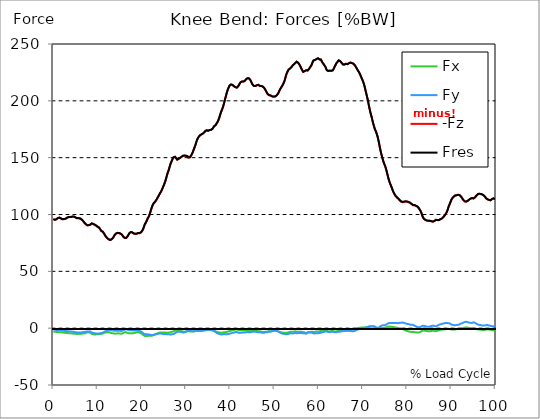
| Category |  Fx |  Fy |  -Fz |  Fres |
|---|---|---|---|---|
| 0.0 | -3.083 | -1.199 | 95.874 | 95.947 |
| 0.167348456675344 | -3.11 | -1.211 | 95.388 | 95.46 |
| 0.334696913350688 | -3.159 | -1.304 | 95.279 | 95.352 |
| 0.5020453700260321 | -3.216 | -1.4 | 95.448 | 95.524 |
| 0.669393826701376 | -3.325 | -1.585 | 95.747 | 95.833 |
| 0.83674228337672 | -3.405 | -1.654 | 96.37 | 96.46 |
| 1.0040907400520642 | -3.399 | -1.592 | 96.718 | 96.81 |
| 1.1621420602454444 | -3.448 | -1.61 | 97.039 | 97.135 |
| 1.3294905169207885 | -3.577 | -1.781 | 97.207 | 97.317 |
| 1.4968389735961325 | -3.534 | -1.724 | 97.079 | 97.185 |
| 1.6641874302714765 | -3.531 | -1.767 | 96.593 | 96.695 |
| 1.8315358869468206 | -3.72 | -2.048 | 95.954 | 96.06 |
| 1.9988843436221646 | -3.826 | -2.239 | 95.81 | 95.921 |
| 2.1662328002975086 | -3.857 | -2.257 | 95.777 | 95.89 |
| 2.333581256972853 | -3.93 | -2.31 | 95.848 | 95.965 |
| 2.5009297136481967 | -4.018 | -2.383 | 95.943 | 96.065 |
| 2.6682781703235405 | -4.071 | -2.426 | 96.116 | 96.24 |
| 2.8356266269988843 | -4.173 | -2.52 | 96.348 | 96.48 |
| 3.002975083674229 | -4.272 | -2.604 | 96.794 | 96.93 |
| 3.1703235403495724 | -4.304 | -2.62 | 97.168 | 97.306 |
| 3.337671997024917 | -4.336 | -2.635 | 97.542 | 97.682 |
| 3.4957233172182973 | -4.436 | -2.772 | 97.729 | 97.876 |
| 3.663071773893641 | -4.496 | -2.835 | 97.71 | 97.861 |
| 3.8304202305689854 | -4.488 | -2.792 | 97.699 | 97.848 |
| 3.997768687244329 | -4.543 | -2.868 | 97.784 | 97.94 |
| 4.165117143919673 | -4.644 | -3.004 | 97.92 | 98.085 |
| 4.332465600595017 | -4.752 | -3.141 | 98.023 | 98.201 |
| 4.499814057270361 | -4.808 | -3.254 | 98.045 | 98.231 |
| 4.667162513945706 | -4.84 | -3.345 | 98.002 | 98.194 |
| 4.834510970621049 | -4.851 | -3.412 | 97.743 | 97.933 |
| 5.001859427296393 | -4.947 | -3.552 | 97.339 | 97.536 |
| 5.169207883971737 | -5.044 | -3.691 | 96.933 | 97.14 |
| 5.336556340647081 | -5.121 | -3.804 | 96.595 | 96.808 |
| 5.503904797322425 | -5.067 | -3.765 | 96.614 | 96.822 |
| 5.671253253997769 | -5 | -3.726 | 96.638 | 96.842 |
| 5.82930457419115 | -4.994 | -3.727 | 96.702 | 96.904 |
| 5.996653030866494 | -5.033 | -3.828 | 96.531 | 96.74 |
| 6.164001487541838 | -5.051 | -3.9 | 96.261 | 96.474 |
| 6.331349944217181 | -5.001 | -3.883 | 95.634 | 95.845 |
| 6.498698400892526 | -4.864 | -3.615 | 95.201 | 95.394 |
| 6.66604685756787 | -4.754 | -3.441 | 94.435 | 94.618 |
| 6.833395314243213 | -4.66 | -3.332 | 93.594 | 93.769 |
| 7.000743770918558 | -4.619 | -3.378 | 92.768 | 92.946 |
| 7.168092227593902 | -4.454 | -3.306 | 92.055 | 92.224 |
| 7.335440684269246 | -4.215 | -3.164 | 91.409 | 91.565 |
| 7.50278914094459 | -3.975 | -3.02 | 90.764 | 90.905 |
| 7.6701375976199335 | -3.696 | -2.868 | 90.472 | 90.6 |
| 7.837486054295278 | -3.617 | -2.786 | 90.532 | 90.66 |
| 7.995537374488658 | -3.674 | -2.926 | 90.522 | 90.661 |
| 8.162885831164003 | -3.767 | -2.951 | 90.671 | 90.82 |
| 8.330234287839346 | -3.894 | -2.985 | 90.91 | 91.069 |
| 8.49758274451469 | -4.419 | -3.454 | 91.59 | 91.779 |
| 8.664931201190035 | -4.979 | -3.924 | 91.981 | 92.204 |
| 8.832279657865378 | -5.278 | -4.166 | 91.835 | 92.085 |
| 8.999628114540721 | -5.357 | -4.202 | 91.552 | 91.81 |
| 9.166976571216066 | -5.47 | -4.311 | 91.224 | 91.495 |
| 9.334325027891412 | -5.601 | -4.509 | 90.849 | 91.14 |
| 9.501673484566755 | -5.506 | -4.527 | 90.417 | 90.703 |
| 9.669021941242098 | -5.451 | -4.668 | 90.115 | 90.405 |
| 9.836370397917442 | -5.474 | -4.849 | 89.77 | 90.074 |
| 10.003718854592787 | -5.406 | -4.834 | 88.998 | 89.301 |
| 10.17106731126813 | -5.276 | -4.742 | 88.582 | 88.874 |
| 10.329118631461512 | -5.164 | -4.682 | 88.345 | 88.627 |
| 10.496467088136853 | -5.136 | -4.658 | 87.548 | 87.831 |
| 10.663815544812199 | -5.071 | -4.5 | 86.421 | 86.696 |
| 10.831164001487544 | -5.03 | -4.322 | 85.37 | 85.636 |
| 10.998512458162887 | -4.944 | -4.205 | 85.184 | 85.441 |
| 11.16586091483823 | -4.729 | -3.959 | 84.766 | 85 |
| 11.333209371513574 | -4.427 | -3.604 | 83.988 | 84.194 |
| 11.50055782818892 | -4.079 | -3.179 | 82.862 | 83.039 |
| 11.667906284864264 | -3.889 | -2.852 | 81.714 | 81.874 |
| 11.835254741539607 | -3.764 | -2.598 | 80.678 | 80.826 |
| 12.00260319821495 | -3.738 | -2.417 | 79.815 | 79.954 |
| 12.169951654890292 | -3.712 | -2.195 | 79.183 | 79.314 |
| 12.337300111565641 | -3.618 | -1.935 | 78.685 | 78.805 |
| 12.504648568240984 | -3.571 | -1.765 | 78.179 | 78.294 |
| 12.662699888434362 | -3.686 | -1.746 | 77.58 | 77.698 |
| 12.830048345109708 | -3.909 | -1.782 | 77.49 | 77.616 |
| 12.997396801785053 | -4.198 | -1.904 | 77.768 | 77.91 |
| 13.164745258460396 | -4.452 | -1.959 | 78.076 | 78.23 |
| 13.33209371513574 | -4.432 | -1.964 | 78.618 | 78.768 |
| 13.499442171811083 | -4.57 | -2.033 | 79.433 | 79.592 |
| 13.666790628486426 | -4.756 | -2.191 | 80.542 | 80.712 |
| 13.834139085161771 | -4.891 | -2.294 | 81.702 | 81.881 |
| 14.001487541837117 | -4.836 | -2.349 | 82.576 | 82.752 |
| 14.16883599851246 | -4.748 | -2.296 | 83.135 | 83.303 |
| 14.336184455187803 | -4.625 | -2.244 | 83.53 | 83.689 |
| 14.503532911863147 | -4.586 | -2.216 | 83.723 | 83.879 |
| 14.670881368538492 | -4.552 | -2.181 | 83.707 | 83.86 |
| 14.828932688731873 | -4.536 | -2.171 | 83.541 | 83.694 |
| 14.996281145407215 | -4.626 | -2.281 | 83.36 | 83.522 |
| 15.163629602082558 | -4.757 | -2.382 | 83.116 | 83.29 |
| 15.330978058757903 | -4.884 | -2.47 | 82.838 | 83.024 |
| 15.498326515433247 | -4.795 | -2.341 | 82.164 | 82.341 |
| 15.665674972108594 | -4.556 | -2.109 | 81.316 | 81.474 |
| 15.833023428783937 | -4.214 | -1.811 | 80.322 | 80.454 |
| 16.00037188545928 | -3.761 | -1.443 | 79.725 | 79.84 |
| 16.167720342134626 | -3.379 | -1.114 | 79.257 | 79.359 |
| 16.335068798809967 | -3.489 | -1.081 | 79.267 | 79.382 |
| 16.502417255485312 | -3.664 | -1.084 | 79.408 | 79.539 |
| 16.669765712160658 | -3.98 | -1.292 | 80.031 | 80.181 |
| 16.837114168836 | -4.322 | -1.576 | 81.044 | 81.223 |
| 17.004462625511344 | -4.488 | -1.759 | 82.199 | 82.394 |
| 17.16251394570472 | -4.567 | -1.882 | 83.38 | 83.582 |
| 17.32986240238007 | -4.516 | -1.888 | 84.128 | 84.32 |
| 17.497210859055414 | -4.406 | -1.83 | 84.412 | 84.582 |
| 17.664559315730756 | -4.438 | -1.905 | 84.4 | 84.561 |
| 17.8319077724061 | -4.496 | -2.013 | 84.177 | 84.336 |
| 17.999256229081443 | -4.483 | -2.022 | 83.651 | 83.808 |
| 18.166604685756788 | -4.369 | -1.969 | 83.211 | 83.365 |
| 18.333953142432133 | -4.25 | -1.973 | 83.053 | 83.199 |
| 18.501301599107478 | -3.948 | -1.868 | 82.995 | 83.13 |
| 18.668650055782823 | -3.673 | -1.768 | 82.941 | 83.073 |
| 18.835998512458165 | -3.424 | -1.68 | 83.007 | 83.138 |
| 19.00334696913351 | -3.449 | -1.779 | 83.352 | 83.481 |
| 19.170695425808855 | -3.568 | -1.939 | 83.628 | 83.757 |
| 19.338043882484197 | -3.693 | -2.136 | 83.579 | 83.714 |
| 19.496095202677576 | -3.852 | -2.405 | 83.545 | 83.686 |
| 19.66344365935292 | -4.118 | -2.647 | 83.668 | 83.825 |
| 19.830792116028263 | -4.511 | -3.049 | 84.252 | 84.44 |
| 19.998140572703612 | -5.004 | -3.474 | 84.925 | 85.15 |
| 20.165489029378953 | -5.494 | -3.934 | 85.958 | 86.231 |
| 20.3328374860543 | -6.051 | -4.477 | 87.384 | 87.717 |
| 20.500185942729644 | -6.588 | -5.002 | 89.212 | 89.608 |
| 20.667534399404985 | -6.801 | -5.235 | 91.002 | 91.421 |
| 20.83488285608033 | -6.723 | -5.167 | 92.1 | 92.504 |
| 21.002231312755672 | -6.82 | -5.348 | 93.355 | 93.772 |
| 21.16957976943102 | -6.894 | -5.499 | 94.76 | 95.186 |
| 21.336928226106362 | -6.808 | -5.469 | 96.235 | 96.647 |
| 21.504276682781704 | -6.676 | -5.409 | 97.344 | 97.738 |
| 21.67162513945705 | -6.69 | -5.525 | 98.707 | 99.104 |
| 21.82967645965043 | -6.753 | -5.729 | 100.572 | 100.978 |
| 21.997024916325774 | -6.794 | -5.944 | 102.794 | 103.206 |
| 22.16437337300112 | -6.73 | -6.07 | 104.955 | 105.361 |
| 22.33172182967646 | -6.556 | -6.114 | 106.757 | 107.148 |
| 22.499070286351806 | -6.359 | -6.131 | 108.46 | 108.834 |
| 22.666418743027148 | -6.099 | -5.997 | 109.594 | 109.943 |
| 22.833767199702496 | -5.765 | -5.847 | 110.454 | 110.77 |
| 23.00111565637784 | -5.45 | -5.578 | 111.036 | 111.319 |
| 23.168464113053183 | -5.17 | -5.326 | 111.767 | 112.021 |
| 23.335812569728528 | -4.94 | -5.17 | 112.973 | 113.207 |
| 23.50316102640387 | -4.676 | -5.034 | 114.248 | 114.462 |
| 23.670509483079215 | -4.408 | -4.953 | 115.324 | 115.522 |
| 23.83785793975456 | -4.224 | -4.906 | 116.489 | 116.678 |
| 23.995909259947936 | -3.947 | -4.739 | 117.728 | 117.905 |
| 24.163257716623285 | -3.75 | -4.661 | 118.88 | 119.048 |
| 24.330606173298627 | -3.727 | -4.774 | 120.01 | 120.18 |
| 24.49795462997397 | -3.753 | -4.928 | 121.373 | 121.55 |
| 24.665303086649313 | -3.78 | -5.082 | 122.746 | 122.93 |
| 24.83265154332466 | -3.829 | -5.262 | 124.409 | 124.602 |
| 25.0 | -3.811 | -5.314 | 125.967 | 126.161 |
| 25.167348456675345 | -3.809 | -5.306 | 127.635 | 127.829 |
| 25.334696913350694 | -3.833 | -5.197 | 129.5 | 129.69 |
| 25.502045370026035 | -3.946 | -5.219 | 131.72 | 131.907 |
| 25.669393826701377 | -4.029 | -5.311 | 134.08 | 134.266 |
| 25.836742283376722 | -3.983 | -5.311 | 136.375 | 136.552 |
| 26.004090740052067 | -3.867 | -5.31 | 138.152 | 138.33 |
| 26.17143919672741 | -3.726 | -5.345 | 140.076 | 140.253 |
| 26.329490516920792 | -3.692 | -5.479 | 142.462 | 142.642 |
| 26.49683897359613 | -3.588 | -5.547 | 144.569 | 144.746 |
| 26.66418743027148 | -3.358 | -5.464 | 146.098 | 146.265 |
| 26.831535886946828 | -3.169 | -5.351 | 147.624 | 147.78 |
| 26.998884343622166 | -2.979 | -5.239 | 149.15 | 149.297 |
| 27.166232800297514 | -2.776 | -5.184 | 150.204 | 150.346 |
| 27.333581256972852 | -2.515 | -4.977 | 150.671 | 150.801 |
| 27.5009297136482 | -2.272 | -4.521 | 150.708 | 150.825 |
| 27.668278170323543 | -2.143 | -3.98 | 150.118 | 150.224 |
| 27.835626626998888 | -2.095 | -3.606 | 149.122 | 149.226 |
| 28.002975083674233 | -2.088 | -3.304 | 148.217 | 148.319 |
| 28.170323540349575 | -2.197 | -3.329 | 148.574 | 148.677 |
| 28.33767199702492 | -2.219 | -3.225 | 148.968 | 149.071 |
| 28.50502045370026 | -2.298 | -3.183 | 149.416 | 149.52 |
| 28.663071773893645 | -2.403 | -3.179 | 149.895 | 150 |
| 28.830420230568986 | -2.465 | -3.215 | 150.326 | 150.435 |
| 28.99776868724433 | -2.631 | -3.442 | 150.741 | 150.857 |
| 29.165117143919673 | -2.879 | -3.727 | 151.183 | 151.306 |
| 29.33246560059502 | -3.039 | -3.873 | 151.62 | 151.748 |
| 29.499814057270367 | -3.056 | -3.786 | 151.639 | 151.766 |
| 29.66716251394571 | -3.061 | -3.606 | 151.728 | 151.856 |
| 29.834510970621054 | -3.066 | -3.422 | 151.826 | 151.955 |
| 30.00185942729639 | -2.93 | -3.059 | 151.581 | 151.708 |
| 30.169207883971744 | -2.806 | -2.639 | 151.255 | 151.381 |
| 30.33655634064708 | -2.772 | -2.394 | 151.127 | 151.254 |
| 30.50390479732243 | -2.759 | -2.293 | 150.1 | 150.228 |
| 30.671253253997772 | -2.765 | -2.286 | 149.84 | 149.967 |
| 30.829304574191156 | -2.85 | -2.34 | 150.212 | 150.347 |
| 30.996653030866494 | -2.908 | -2.347 | 150.925 | 151.067 |
| 31.164001487541842 | -2.956 | -2.417 | 151.907 | 152.057 |
| 31.331349944217187 | -3.009 | -2.592 | 153.12 | 153.277 |
| 31.498698400892525 | -3.04 | -2.806 | 154.511 | 154.672 |
| 31.666046857567874 | -2.993 | -2.831 | 156.281 | 156.433 |
| 31.833395314243212 | -2.808 | -2.762 | 158.005 | 158.141 |
| 32.00074377091856 | -2.529 | -2.621 | 159.81 | 159.926 |
| 32.1680922275939 | -2.25 | -2.48 | 161.616 | 161.711 |
| 32.33544068426925 | -2.282 | -2.484 | 163.821 | 163.909 |
| 32.50278914094459 | -2.283 | -2.427 | 165.693 | 165.771 |
| 32.670137597619934 | -2.255 | -2.414 | 167.051 | 167.122 |
| 32.83748605429528 | -2.244 | -2.438 | 168.122 | 168.188 |
| 33.004834510970625 | -2.295 | -2.53 | 168.989 | 169.052 |
| 33.162885831164004 | -2.225 | -2.565 | 169.677 | 169.736 |
| 33.33023428783935 | -2.036 | -2.529 | 170.128 | 170.182 |
| 33.497582744514695 | -1.872 | -2.491 | 170.461 | 170.511 |
| 33.664931201190036 | -1.864 | -2.423 | 170.998 | 171.047 |
| 33.83227965786538 | -1.76 | -2.319 | 171.243 | 171.291 |
| 33.99962811454073 | -1.653 | -2.207 | 171.514 | 171.559 |
| 34.16697657121607 | -1.662 | -2.104 | 172.411 | 172.457 |
| 34.33432502789141 | -1.67 | -1.959 | 173.381 | 173.426 |
| 34.50167348456676 | -1.662 | -1.749 | 174.069 | 174.112 |
| 34.6690219412421 | -1.612 | -1.495 | 174.047 | 174.091 |
| 34.83637039791744 | -1.485 | -1.253 | 173.814 | 173.857 |
| 35.00371885459279 | -1.46 | -1.254 | 173.62 | 173.662 |
| 35.17106731126814 | -1.49 | -1.339 | 173.772 | 173.814 |
| 35.338415767943474 | -1.551 | -1.44 | 174.349 | 174.39 |
| 35.49646708813686 | -1.59 | -1.475 | 174.672 | 174.712 |
| 35.6638155448122 | -1.61 | -1.554 | 174.483 | 174.524 |
| 35.831164001487544 | -1.678 | -1.745 | 174.58 | 174.62 |
| 35.998512458162885 | -1.845 | -2.021 | 175.475 | 175.517 |
| 36.165860914838234 | -2.022 | -2.259 | 176.534 | 176.578 |
| 36.333209371513576 | -2.222 | -2.558 | 177.557 | 177.607 |
| 36.50055782818892 | -2.431 | -2.953 | 177.938 | 177.998 |
| 36.667906284864266 | -2.668 | -3.395 | 178.496 | 178.569 |
| 36.83525474153961 | -2.985 | -3.898 | 179.546 | 179.641 |
| 37.002603198214956 | -3.315 | -4.373 | 180.632 | 180.752 |
| 37.1699516548903 | -3.528 | -4.677 | 181.669 | 181.803 |
| 37.337300111565646 | -3.645 | -4.839 | 183.15 | 183.291 |
| 37.50464856824098 | -3.722 | -5.05 | 184.926 | 185.068 |
| 37.66269988843437 | -3.848 | -5.246 | 186.994 | 187.138 |
| 37.83004834510971 | -4.007 | -5.452 | 189.13 | 189.278 |
| 37.99739680178505 | -4.101 | -5.604 | 190.985 | 191.138 |
| 38.16474525846039 | -4.041 | -5.554 | 192.52 | 192.67 |
| 38.33209371513574 | -3.835 | -5.288 | 194.327 | 194.468 |
| 38.49944217181109 | -3.611 | -5.096 | 196.493 | 196.622 |
| 38.666790628486424 | -3.495 | -5.121 | 198.992 | 199.117 |
| 38.83413908516178 | -3.621 | -5.415 | 201.554 | 201.683 |
| 39.001487541837115 | -3.466 | -5.384 | 203.945 | 204.071 |
| 39.16883599851246 | -3.334 | -5.358 | 206.438 | 206.559 |
| 39.336184455187805 | -3.164 | -5.271 | 208.635 | 208.753 |
| 39.503532911863154 | -2.907 | -5.049 | 210.465 | 210.569 |
| 39.670881368538495 | -2.659 | -4.897 | 211.871 | 211.969 |
| 39.83822982521384 | -2.6 | -4.92 | 213.326 | 213.421 |
| 39.996281145407224 | -2.472 | -4.762 | 214.187 | 214.273 |
| 40.163629602082565 | -2.212 | -4.503 | 214.373 | 214.446 |
| 40.33097805875791 | -2.019 | -4.312 | 214.353 | 214.42 |
| 40.498326515433256 | -1.829 | -4.069 | 213.933 | 213.994 |
| 40.6656749721086 | -1.726 | -3.9 | 213.253 | 213.311 |
| 40.83302342878393 | -1.591 | -3.802 | 212.844 | 212.901 |
| 41.00037188545929 | -1.433 | -3.728 | 212.621 | 212.676 |
| 41.16772034213463 | -1.23 | -3.52 | 212.002 | 212.054 |
| 41.33506879880997 | -1.045 | -3.325 | 211.506 | 211.555 |
| 41.50241725548531 | -1.092 | -3.382 | 211.595 | 211.646 |
| 41.66976571216066 | -1.359 | -3.71 | 212.145 | 212.206 |
| 41.837114168836 | -1.517 | -3.882 | 213.024 | 213.09 |
| 42.004462625511344 | -1.757 | -4.135 | 214.211 | 214.286 |
| 42.17181108218669 | -1.877 | -4.155 | 215.334 | 215.409 |
| 42.32986240238007 | -1.921 | -4.101 | 216.25 | 216.323 |
| 42.497210859055414 | -1.972 | -4.068 | 216.84 | 216.909 |
| 42.66455931573076 | -1.932 | -3.925 | 217.018 | 217.08 |
| 42.831907772406105 | -1.865 | -3.774 | 217.008 | 217.065 |
| 42.999256229081446 | -1.856 | -3.721 | 216.938 | 216.991 |
| 43.16660468575679 | -1.882 | -3.694 | 217.068 | 217.119 |
| 43.33395314243214 | -2 | -3.75 | 217.739 | 217.792 |
| 43.50130159910748 | -1.979 | -3.668 | 218.7 | 218.752 |
| 43.66865005578282 | -1.976 | -3.524 | 219.415 | 219.466 |
| 43.83599851245817 | -1.941 | -3.456 | 219.732 | 219.788 |
| 44.00334696913351 | -1.968 | -3.423 | 219.814 | 219.87 |
| 44.17069542580886 | -2.215 | -3.634 | 219.883 | 219.944 |
| 44.3380438824842 | -2.404 | -3.723 | 219.51 | 219.572 |
| 44.49609520267758 | -2.393 | -3.664 | 218.494 | 218.554 |
| 44.66344365935292 | -2.33 | -3.525 | 217.301 | 217.358 |
| 44.83079211602827 | -2.279 | -3.345 | 215.879 | 215.933 |
| 44.99814057270361 | -2.226 | -3.164 | 214.461 | 214.513 |
| 45.16548902937895 | -2.232 | -3.085 | 213.609 | 213.661 |
| 45.332837486054295 | -2.184 | -3.003 | 213.075 | 213.126 |
| 45.500185942729644 | -2.168 | -3.014 | 212.843 | 212.895 |
| 45.66753439940499 | -2.274 | -3.147 | 212.988 | 213.046 |
| 45.83488285608033 | -2.414 | -3.329 | 213.335 | 213.399 |
| 46.00223131275568 | -2.449 | -3.402 | 213.708 | 213.772 |
| 46.16957976943102 | -2.633 | -3.621 | 214.207 | 214.272 |
| 46.336928226106366 | -2.635 | -3.642 | 214.054 | 214.118 |
| 46.50427668278171 | -2.807 | -3.715 | 213.646 | 213.71 |
| 46.671625139457056 | -2.69 | -3.446 | 213.117 | 213.177 |
| 46.829676459650436 | -2.72 | -3.424 | 212.889 | 212.949 |
| 46.99702491632577 | -3.081 | -3.838 | 213.065 | 213.136 |
| 47.16437337300112 | -3.303 | -4.122 | 213.026 | 213.106 |
| 47.33172182967646 | -3.279 | -4.123 | 212.528 | 212.608 |
| 47.49907028635181 | -3.296 | -4.099 | 211.972 | 212.051 |
| 47.66641874302716 | -3.328 | -4.059 | 211.319 | 211.398 |
| 47.83376719970249 | -3.142 | -3.758 | 210.335 | 210.407 |
| 48.001115656377834 | -3.042 | -3.626 | 209.131 | 209.2 |
| 48.16846411305319 | -3.074 | -3.669 | 207.859 | 207.931 |
| 48.33581256972853 | -3.057 | -3.615 | 206.667 | 206.739 |
| 48.50316102640387 | -2.917 | -3.264 | 205.755 | 205.824 |
| 48.67050948307921 | -2.707 | -3.008 | 205.189 | 205.254 |
| 48.837857939754564 | -2.821 | -3.162 | 204.91 | 204.983 |
| 49.005206396429905 | -2.803 | -3.158 | 204.759 | 204.832 |
| 49.163257716623285 | -2.753 | -3.107 | 204.568 | 204.64 |
| 49.33060617329863 | -2.565 | -2.846 | 204.199 | 204.264 |
| 49.49795462997397 | -2.376 | -2.584 | 203.83 | 203.889 |
| 49.66530308664932 | -2.212 | -2.397 | 203.577 | 203.627 |
| 49.832651543324666 | -2.223 | -2.344 | 203.654 | 203.704 |
| 50.0 | -2.304 | -2.32 | 203.734 | 203.784 |
| 50.16734845667534 | -2.321 | -2.283 | 203.847 | 203.896 |
| 50.33469691335069 | -2.268 | -2.265 | 204.114 | 204.162 |
| 50.50204537002604 | -2.467 | -2.561 | 204.848 | 204.904 |
| 50.66939382670139 | -2.575 | -2.652 | 205.633 | 205.69 |
| 50.836742283376715 | -2.681 | -2.758 | 206.504 | 206.561 |
| 51.00409074005207 | -3.034 | -3.271 | 207.912 | 207.978 |
| 51.17143919672741 | -3.371 | -3.772 | 209.358 | 209.431 |
| 51.32949051692079 | -3.545 | -4.067 | 210.542 | 210.62 |
| 51.496838973596134 | -3.698 | -4.36 | 211.653 | 211.739 |
| 51.66418743027148 | -3.791 | -4.627 | 212.679 | 212.769 |
| 51.831535886946824 | -3.911 | -4.862 | 213.734 | 213.83 |
| 51.99888434362217 | -3.976 | -5.005 | 215.018 | 215.12 |
| 52.16623280029752 | -3.912 | -4.981 | 216.469 | 216.572 |
| 52.33358125697285 | -3.981 | -5.15 | 218.309 | 218.419 |
| 52.5009297136482 | -4.112 | -5.327 | 220.761 | 220.875 |
| 52.668278170323546 | -4.124 | -5.336 | 223.093 | 223.205 |
| 52.835626626998895 | -4.035 | -5.259 | 224.707 | 224.817 |
| 53.00297508367424 | -3.855 | -5.129 | 226.11 | 226.216 |
| 53.17032354034958 | -3.712 | -5.038 | 227.343 | 227.446 |
| 53.33767199702492 | -3.514 | -4.824 | 228.045 | 228.14 |
| 53.50502045370027 | -3.306 | -4.642 | 228.369 | 228.453 |
| 53.663071773893655 | -3.143 | -4.509 | 228.75 | 228.827 |
| 53.83042023056899 | -3.105 | -4.447 | 229.611 | 229.686 |
| 53.99776868724433 | -3.25 | -4.609 | 230.581 | 230.664 |
| 54.16511714391967 | -3.212 | -4.6 | 231.258 | 231.343 |
| 54.33246560059503 | -3.15 | -4.56 | 231.871 | 231.958 |
| 54.49981405727037 | -3.012 | -4.407 | 232.3 | 232.384 |
| 54.667162513945705 | -2.799 | -4.116 | 233.088 | 233.16 |
| 54.834510970621054 | -2.938 | -4.296 | 233.946 | 234.026 |
| 55.0018594272964 | -3.085 | -4.456 | 234.383 | 234.473 |
| 55.169207883971744 | -3.105 | -4.403 | 233.981 | 234.072 |
| 55.336556340647086 | -3.104 | -4.327 | 233.475 | 233.562 |
| 55.50390479732243 | -3.103 | -4.285 | 232.749 | 232.834 |
| 55.671253253997776 | -3.103 | -4.305 | 231.651 | 231.737 |
| 55.83860171067312 | -3.126 | -4.349 | 230.424 | 230.51 |
| 55.9966530308665 | -3.074 | -4.301 | 229.007 | 229.092 |
| 56.16400148754184 | -3.203 | -4.362 | 227.729 | 227.812 |
| 56.33134994421718 | -3.452 | -4.406 | 226.405 | 226.488 |
| 56.498698400892536 | -3.577 | -4.382 | 225.448 | 225.527 |
| 56.66604685756788 | -3.544 | -4.357 | 225.489 | 225.566 |
| 56.83339531424321 | -3.76 | -4.638 | 226.139 | 226.224 |
| 57.00074377091856 | -4.05 | -4.867 | 226.709 | 226.804 |
| 57.16809222759391 | -4.124 | -4.858 | 226.879 | 226.974 |
| 57.33544068426925 | -3.966 | -4.571 | 226.83 | 226.916 |
| 57.5027891409446 | -3.695 | -4.142 | 226.615 | 226.685 |
| 57.670137597619934 | -3.342 | -3.715 | 227.16 | 227.217 |
| 57.83748605429528 | -3.405 | -3.777 | 228.171 | 228.229 |
| 58.004834510970625 | -3.514 | -3.942 | 229.239 | 229.301 |
| 58.16288583116401 | -3.364 | -3.853 | 230.131 | 230.19 |
| 58.330234287839346 | -3.178 | -3.795 | 231.253 | 231.307 |
| 58.497582744514695 | -3.082 | -3.943 | 232.74 | 232.795 |
| 58.66493120119004 | -3.265 | -4.352 | 234.412 | 234.477 |
| 58.832279657865385 | -3.361 | -4.593 | 235.527 | 235.596 |
| 58.999628114540734 | -3.375 | -4.676 | 235.791 | 235.864 |
| 59.16697657121607 | -3.203 | -4.539 | 235.904 | 235.971 |
| 59.33432502789142 | -3 | -4.374 | 236.006 | 236.067 |
| 59.50167348456676 | -2.939 | -4.395 | 236.726 | 236.786 |
| 59.66902194124211 | -3.034 | -4.577 | 237.474 | 237.54 |
| 59.83637039791745 | -3.015 | -4.512 | 237.402 | 237.467 |
| 60.00371885459278 | -2.849 | -4.272 | 236.901 | 236.96 |
| 60.17106731126813 | -2.653 | -4.161 | 236.438 | 236.492 |
| 60.33841576794349 | -2.594 | -4.184 | 236.562 | 236.618 |
| 60.49646708813685 | -2.529 | -4.122 | 236.286 | 236.342 |
| 60.6638155448122 | -2.352 | -3.784 | 234.915 | 234.964 |
| 60.831164001487544 | -2.186 | -3.536 | 233.771 | 233.811 |
| 60.99851245816289 | -2.177 | -3.422 | 232.834 | 232.872 |
| 61.16586091483824 | -2.255 | -3.361 | 231.949 | 231.986 |
| 61.333209371513576 | -2.165 | -3.106 | 230.925 | 230.957 |
| 61.50055782818892 | -2.056 | -2.849 | 229.966 | 229.993 |
| 61.667906284864266 | -2.116 | -2.767 | 228.369 | 228.396 |
| 61.835254741539615 | -2.297 | -2.873 | 226.9 | 226.931 |
| 62.002603198214956 | -2.594 | -3.186 | 226.376 | 226.415 |
| 62.16995165489029 | -2.707 | -3.32 | 226.254 | 226.297 |
| 62.33730011156564 | -2.876 | -3.522 | 226.407 | 226.455 |
| 62.504648568240995 | -2.867 | -3.584 | 226.553 | 226.603 |
| 62.67199702491633 | -2.752 | -3.392 | 226.477 | 226.523 |
| 62.83004834510971 | -2.635 | -3.194 | 226.399 | 226.441 |
| 62.99739680178505 | -2.527 | -3.033 | 226.452 | 226.49 |
| 63.1647452584604 | -2.432 | -2.957 | 226.805 | 226.841 |
| 63.33209371513575 | -2.626 | -3.209 | 227.782 | 227.825 |
| 63.4994421718111 | -2.827 | -3.469 | 229.119 | 229.168 |
| 63.666790628486424 | -2.969 | -3.675 | 230.491 | 230.544 |
| 63.83413908516177 | -2.932 | -3.709 | 231.891 | 231.944 |
| 64.00148754183712 | -2.794 | -3.543 | 233.071 | 233.119 |
| 64.16883599851248 | -2.543 | -3.284 | 233.802 | 233.843 |
| 64.3361844551878 | -2.41 | -3.085 | 234.682 | 234.719 |
| 64.50353291186315 | -2.589 | -3.256 | 235.583 | 235.623 |
| 64.6708813685385 | -2.623 | -3.265 | 235.728 | 235.77 |
| 64.83822982521384 | -2.268 | -2.815 | 235.019 | 235.049 |
| 65.00557828188919 | -2.211 | -2.782 | 234.224 | 234.253 |
| 65.16362960208257 | -2.238 | -2.897 | 233.413 | 233.443 |
| 65.3309780587579 | -2.08 | -2.753 | 232.576 | 232.603 |
| 65.49832651543326 | -1.888 | -2.557 | 232.009 | 232.032 |
| 65.6656749721086 | -1.763 | -2.454 | 231.939 | 231.959 |
| 65.83302342878395 | -1.693 | -2.411 | 231.941 | 231.961 |
| 66.00037188545929 | -1.796 | -2.515 | 232.286 | 232.308 |
| 66.16772034213463 | -1.905 | -2.583 | 232.573 | 232.598 |
| 66.33506879880998 | -1.736 | -2.378 | 232.279 | 232.3 |
| 66.50241725548531 | -1.628 | -2.289 | 232.276 | 232.295 |
| 66.66976571216065 | -1.579 | -2.301 | 232.499 | 232.52 |
| 66.83711416883601 | -1.571 | -2.461 | 233.089 | 233.109 |
| 67.00446262551135 | -1.484 | -2.566 | 233.585 | 233.606 |
| 67.1718110821867 | -1.428 | -2.658 | 233.653 | 233.676 |
| 67.32986240238007 | -1.162 | -2.521 | 233.283 | 233.302 |
| 67.49721085905541 | -1.153 | -2.704 | 233.244 | 233.266 |
| 67.66455931573076 | -1.073 | -2.779 | 232.965 | 232.987 |
| 67.83190777240611 | -0.973 | -2.814 | 232.628 | 232.652 |
| 67.99925622908145 | -0.748 | -2.572 | 231.916 | 231.936 |
| 68.16660468575678 | -0.622 | -2.361 | 231.291 | 231.308 |
| 68.33395314243214 | -0.45 | -2.079 | 230.414 | 230.43 |
| 68.50130159910749 | -0.175 | -1.688 | 229.165 | 229.181 |
| 68.66865005578282 | 0.043 | -1.292 | 227.953 | 227.971 |
| 68.83599851245816 | 0.102 | -1.159 | 226.858 | 226.877 |
| 69.00334696913352 | 0.232 | -0.935 | 225.796 | 225.816 |
| 69.17069542580886 | 0.361 | -0.711 | 224.733 | 224.754 |
| 69.3380438824842 | 0.37 | -0.679 | 223.438 | 223.461 |
| 69.50539233915956 | 0.427 | -0.531 | 221.876 | 221.903 |
| 69.66344365935292 | 0.602 | -0.153 | 220.305 | 220.342 |
| 69.83079211602826 | 0.801 | 0.271 | 218.744 | 218.791 |
| 69.99814057270362 | 0.575 | 0.027 | 217.299 | 217.347 |
| 70.16548902937896 | 0.499 | -0.057 | 215.435 | 215.485 |
| 70.33283748605429 | 0.611 | 0.108 | 213.153 | 213.203 |
| 70.50018594272964 | 0.692 | 0.341 | 210.475 | 210.529 |
| 70.667534399405 | 0.776 | 0.553 | 207.776 | 207.838 |
| 70.83488285608033 | 0.866 | 0.769 | 205.074 | 205.142 |
| 71.00223131275568 | 0.965 | 0.976 | 202.34 | 202.416 |
| 71.16957976943102 | 1.133 | 1.19 | 199.409 | 199.496 |
| 71.33692822610637 | 1.353 | 1.425 | 196.098 | 196.186 |
| 71.50427668278171 | 1.498 | 1.599 | 192.886 | 192.975 |
| 71.67162513945706 | 1.539 | 1.643 | 190.026 | 190.112 |
| 71.8389735961324 | 1.523 | 1.607 | 187.524 | 187.609 |
| 71.99702491632577 | 1.539 | 1.632 | 185.26 | 185.347 |
| 72.16437337300113 | 1.602 | 1.721 | 182.385 | 182.469 |
| 72.33172182967647 | 1.519 | 1.634 | 179.805 | 179.889 |
| 72.49907028635181 | 1.446 | 1.532 | 177.548 | 177.63 |
| 72.66641874302715 | 1.343 | 1.378 | 175.397 | 175.477 |
| 72.8337671997025 | 0.962 | 0.902 | 173.884 | 173.947 |
| 73.00111565637783 | 0.516 | 0.483 | 172.324 | 172.372 |
| 73.16846411305319 | 0.279 | 0.41 | 170.285 | 170.339 |
| 73.33581256972853 | 0.1 | 0.37 | 168.164 | 168.223 |
| 73.50316102640387 | 0.075 | 0.496 | 165.243 | 165.307 |
| 73.67050948307921 | 0.066 | 0.754 | 162.096 | 162.164 |
| 73.83785793975457 | 0.132 | 1.406 | 158.673 | 158.743 |
| 74.00520639642991 | 0.139 | 1.843 | 155.8 | 155.875 |
| 74.16325771662328 | 0.161 | 2.171 | 153.004 | 153.083 |
| 74.33060617329863 | 0.152 | 2.36 | 150.591 | 150.676 |
| 74.49795462997398 | 0.199 | 2.532 | 148.239 | 148.332 |
| 74.66530308664932 | 0.251 | 2.644 | 146.023 | 146.121 |
| 74.83265154332466 | 0.293 | 2.603 | 144.271 | 144.368 |
| 75.00000000000001 | 0.296 | 2.585 | 142.792 | 142.89 |
| 75.16734845667534 | 0.555 | 2.892 | 140.702 | 140.808 |
| 75.3346969133507 | 0.881 | 3.34 | 138.328 | 138.434 |
| 75.50204537002605 | 1.148 | 3.795 | 135.808 | 135.928 |
| 75.66939382670138 | 1.33 | 4.155 | 133.228 | 133.364 |
| 75.83674228337672 | 1.474 | 4.49 | 130.627 | 130.767 |
| 76.00409074005208 | 1.474 | 4.627 | 128.618 | 128.767 |
| 76.17143919672742 | 1.345 | 4.549 | 126.937 | 127.083 |
| 76.33878765340276 | 1.232 | 4.493 | 125.268 | 125.414 |
| 76.49683897359614 | 1.143 | 4.425 | 123.701 | 123.844 |
| 76.66418743027148 | 1.075 | 4.432 | 121.881 | 122.025 |
| 76.83153588694682 | 1.032 | 4.625 | 120.111 | 120.272 |
| 76.99888434362218 | 0.877 | 4.56 | 118.809 | 118.972 |
| 77.16623280029752 | 0.747 | 4.573 | 117.643 | 117.806 |
| 77.33358125697285 | 0.629 | 4.591 | 116.532 | 116.699 |
| 77.5009297136482 | 0.525 | 4.516 | 115.762 | 115.931 |
| 77.66827817032356 | 0.418 | 4.494 | 115.001 | 115.174 |
| 77.83562662699889 | 0.258 | 4.498 | 114.326 | 114.515 |
| 78.00297508367423 | 0.01 | 4.376 | 113.77 | 113.977 |
| 78.17032354034959 | -0.016 | 4.508 | 113.068 | 113.297 |
| 78.33767199702493 | -0.014 | 4.723 | 112.324 | 112.585 |
| 78.50502045370027 | -0.153 | 4.806 | 111.662 | 111.948 |
| 78.67236891037561 | -0.368 | 4.808 | 111.164 | 111.466 |
| 78.83042023056899 | -0.634 | 4.812 | 110.862 | 111.174 |
| 78.99776868724433 | -0.778 | 4.932 | 110.741 | 111.061 |
| 79.16511714391969 | -1.155 | 4.721 | 110.849 | 111.181 |
| 79.33246560059503 | -1.44 | 4.542 | 111.112 | 111.434 |
| 79.49981405727036 | -1.703 | 4.353 | 111.325 | 111.63 |
| 79.66716251394571 | -2.007 | 4.099 | 111.327 | 111.634 |
| 79.83451097062107 | -2.268 | 3.894 | 111.236 | 111.542 |
| 80.00185942729641 | -2.472 | 3.761 | 111.122 | 111.42 |
| 80.16920788397174 | -2.642 | 3.666 | 110.952 | 111.247 |
| 80.33655634064709 | -2.811 | 3.561 | 110.776 | 111.068 |
| 80.50390479732243 | -2.973 | 3.339 | 110.503 | 110.781 |
| 80.67125325399778 | -3.179 | 3.089 | 110.083 | 110.354 |
| 80.83860171067312 | -3.322 | 2.924 | 109.535 | 109.805 |
| 80.99665303086651 | -3.319 | 2.905 | 109.124 | 109.394 |
| 81.16400148754184 | -3.173 | 2.995 | 108.5 | 108.775 |
| 81.3313499442172 | -3.218 | 2.902 | 108.152 | 108.436 |
| 81.49869840089255 | -3.372 | 2.555 | 108.07 | 108.336 |
| 81.66604685756786 | -3.578 | 2.146 | 108.108 | 108.375 |
| 81.83339531424322 | -3.612 | 1.88 | 107.812 | 108.074 |
| 82.00074377091858 | -3.618 | 1.605 | 107.491 | 107.742 |
| 82.16809222759392 | -3.657 | 1.321 | 107.158 | 107.399 |
| 82.33544068426926 | -3.847 | 1.017 | 106.818 | 107.045 |
| 82.50278914094459 | -3.871 | 0.822 | 106.198 | 106.414 |
| 82.67013759761994 | -3.756 | 0.72 | 105.341 | 105.547 |
| 82.83748605429528 | -3.573 | 0.878 | 104.168 | 104.354 |
| 83.00483451097062 | -3.335 | 1.116 | 103.203 | 103.368 |
| 83.17218296764597 | -2.926 | 1.356 | 101.843 | 101.976 |
| 83.33023428783935 | -2.416 | 1.817 | 99.849 | 99.951 |
| 83.4975827445147 | -2.127 | 2.073 | 98.169 | 98.257 |
| 83.66493120119004 | -2.029 | 2.169 | 96.906 | 96.988 |
| 83.83227965786537 | -2.102 | 2.132 | 96.006 | 96.083 |
| 83.99962811454073 | -2.265 | 1.885 | 95.534 | 95.603 |
| 84.16697657121607 | -2.341 | 1.659 | 95.126 | 95.191 |
| 84.33432502789142 | -2.417 | 1.433 | 94.718 | 94.777 |
| 84.50167348456677 | -2.615 | 1.296 | 94.565 | 94.627 |
| 84.6690219412421 | -2.725 | 1.306 | 94.397 | 94.462 |
| 84.83637039791745 | -2.826 | 1.165 | 94.521 | 94.586 |
| 85.0037188545928 | -2.728 | 1.219 | 94.474 | 94.532 |
| 85.17106731126813 | -2.635 | 1.53 | 94.383 | 94.441 |
| 85.33841576794349 | -2.543 | 1.843 | 94.293 | 94.349 |
| 85.50576422461883 | -2.426 | 1.979 | 94.041 | 94.094 |
| 85.66381554481221 | -2.325 | 2.057 | 93.843 | 93.895 |
| 85.83116400148755 | -2.243 | 2.117 | 93.728 | 93.779 |
| 85.99851245816289 | -2.272 | 2.091 | 93.917 | 93.969 |
| 86.16586091483823 | -2.461 | 1.991 | 94.302 | 94.357 |
| 86.33320937151358 | -2.7 | 1.649 | 94.944 | 95 |
| 86.50055782818893 | -2.742 | 1.511 | 95.304 | 95.359 |
| 86.66790628486427 | -2.512 | 1.71 | 95.24 | 95.293 |
| 86.83525474153961 | -2.276 | 2.12 | 95.018 | 95.074 |
| 87.00260319821496 | -2.066 | 2.58 | 94.93 | 94.994 |
| 87.16995165489031 | -1.827 | 2.973 | 95.025 | 95.095 |
| 87.33730011156564 | -1.598 | 3.29 | 95.261 | 95.336 |
| 87.504648568241 | -1.358 | 3.449 | 95.799 | 95.877 |
| 87.67199702491634 | -1.308 | 3.455 | 96.419 | 96.495 |
| 87.83004834510972 | -1.208 | 3.701 | 96.404 | 96.491 |
| 87.99739680178506 | -1.1 | 3.96 | 96.917 | 97.014 |
| 88.1647452584604 | -1.067 | 4.108 | 97.626 | 97.729 |
| 88.33209371513574 | -1.07 | 4.243 | 98.394 | 98.501 |
| 88.49944217181108 | -0.98 | 4.435 | 99.222 | 99.335 |
| 88.66679062848644 | -0.954 | 4.534 | 100.15 | 100.266 |
| 88.83413908516178 | -1.025 | 4.48 | 101.245 | 101.356 |
| 89.00148754183712 | -0.803 | 4.514 | 102.564 | 102.672 |
| 89.16883599851246 | -0.708 | 4.392 | 104.222 | 104.323 |
| 89.33618445518782 | -0.575 | 4.377 | 106.473 | 106.571 |
| 89.50353291186315 | -0.648 | 4.289 | 108.08 | 108.175 |
| 89.6708813685385 | -0.782 | 4.092 | 109.633 | 109.724 |
| 89.83822982521386 | -0.998 | 3.604 | 111.281 | 111.364 |
| 90.00557828188919 | -1.214 | 3.116 | 112.929 | 113.004 |
| 90.16362960208257 | -1.279 | 2.897 | 114.102 | 114.175 |
| 90.3309780587579 | -1.249 | 2.847 | 114.892 | 114.966 |
| 90.49832651543326 | -1.255 | 2.725 | 115.589 | 115.658 |
| 90.66567497210859 | -1.218 | 2.606 | 116.218 | 116.283 |
| 90.83302342878395 | -1.165 | 2.608 | 116.647 | 116.71 |
| 91.00037188545929 | -1.061 | 2.669 | 116.776 | 116.839 |
| 91.16772034213463 | -0.878 | 2.851 | 116.882 | 116.948 |
| 91.33506879880998 | -0.765 | 2.892 | 116.944 | 117.009 |
| 91.50241725548533 | -0.785 | 2.785 | 117.28 | 117.342 |
| 91.66976571216065 | -0.658 | 2.948 | 117.392 | 117.453 |
| 91.83711416883601 | -0.408 | 3.373 | 117.058 | 117.126 |
| 92.00446262551137 | -0.202 | 3.836 | 116.468 | 116.548 |
| 92.1718110821867 | -0.118 | 4.102 | 115.77 | 115.859 |
| 92.33915953886203 | -0.112 | 4.226 | 114.944 | 115.039 |
| 92.49721085905541 | -0.032 | 4.497 | 113.86 | 113.962 |
| 92.66455931573077 | 0.09 | 4.826 | 112.843 | 112.957 |
| 92.83190777240611 | 0.344 | 5.112 | 112.185 | 112.312 |
| 92.99925622908145 | 0.598 | 5.398 | 111.528 | 111.668 |
| 93.1666046857568 | 0.688 | 5.634 | 111.133 | 111.289 |
| 93.33395314243214 | 0.703 | 5.649 | 111.235 | 111.393 |
| 93.50130159910749 | 0.686 | 5.59 | 111.467 | 111.622 |
| 93.66865005578283 | 0.527 | 5.336 | 111.904 | 112.046 |
| 93.83599851245818 | 0.269 | 4.97 | 112.376 | 112.503 |
| 94.00334696913353 | 0.176 | 4.857 | 112.991 | 113.115 |
| 94.17069542580886 | 0.04 | 4.749 | 113.575 | 113.697 |
| 94.3380438824842 | 0.041 | 4.747 | 113.884 | 114.004 |
| 94.50539233915954 | -0.006 | 4.667 | 114.23 | 114.347 |
| 94.66344365935292 | -0.07 | 4.611 | 114.401 | 114.515 |
| 94.83079211602828 | 0.079 | 4.896 | 114.252 | 114.375 |
| 94.99814057270362 | 0.143 | 5.116 | 114.033 | 114.167 |
| 95.16548902937897 | 0.046 | 5.043 | 114.393 | 114.521 |
| 95.33283748605432 | -0.192 | 4.69 | 115.044 | 115.155 |
| 95.50018594272963 | -0.44 | 4.331 | 115.817 | 115.912 |
| 95.66753439940499 | -0.703 | 3.902 | 116.608 | 116.69 |
| 95.83488285608034 | -0.972 | 3.459 | 117.364 | 117.43 |
| 96.00223131275567 | -1.098 | 3.224 | 117.859 | 117.92 |
| 96.16957976943102 | -1.185 | 3.009 | 118.177 | 118.231 |
| 96.33692822610638 | -1.256 | 2.84 | 118.273 | 118.324 |
| 96.50427668278171 | -1.307 | 2.732 | 118.136 | 118.185 |
| 96.67162513945706 | -1.311 | 2.654 | 117.921 | 117.97 |
| 96.8389735961324 | -1.383 | 2.568 | 117.568 | 117.618 |
| 96.99702491632577 | -1.54 | 2.349 | 117.557 | 117.608 |
| 97.16437337300111 | -1.625 | 2.221 | 117.244 | 117.298 |
| 97.33172182967647 | -1.533 | 2.325 | 116.703 | 116.758 |
| 97.49907028635181 | -1.552 | 2.238 | 116.204 | 116.264 |
| 97.66641874302715 | -1.389 | 2.445 | 115.297 | 115.354 |
| 97.8337671997025 | -1.164 | 2.79 | 114.274 | 114.329 |
| 98.00111565637785 | -1.025 | 2.9 | 113.648 | 113.702 |
| 98.16846411305319 | -1.042 | 2.794 | 113.329 | 113.381 |
| 98.33581256972855 | -1.203 | 2.42 | 113.093 | 113.146 |
| 98.50316102640389 | -1.252 | 2.376 | 112.826 | 112.879 |
| 98.67050948307921 | -1.29 | 2.355 | 112.502 | 112.555 |
| 98.83785793975456 | -1.37 | 2.196 | 112.44 | 112.492 |
| 99.0052063964299 | -1.525 | 1.876 | 112.744 | 112.792 |
| 99.17255485310525 | -1.719 | 1.631 | 113.547 | 113.592 |
| 99.33060617329863 | -1.804 | 1.586 | 114.303 | 114.346 |
| 99.49795462997399 | -1.807 | 1.73 | 114.135 | 114.179 |
| 99.66530308664933 | -1.729 | 1.804 | 113.816 | 113.856 |
| 99.83265154332467 | -1.65 | 1.878 | 113.496 | 113.533 |
| 100.0 | -1.652 | 1.929 | 113.525 | 113.564 |